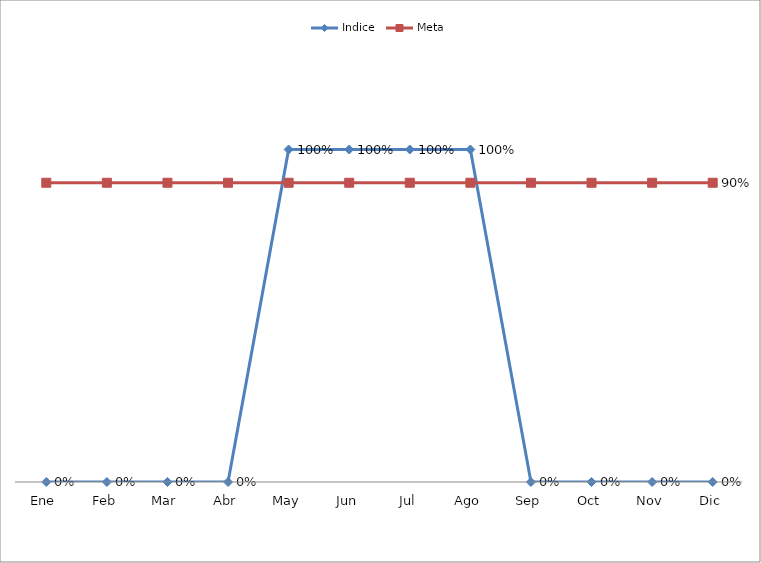
| Category | Indice | Meta |
|---|---|---|
| Ene | 0 | 0.9 |
| Feb | 0 | 0.9 |
| Mar | 0 | 0.9 |
| Abr | 0 | 0.9 |
| May | 1 | 0.9 |
| Jun | 1 | 0.9 |
| Jul | 1 | 0.9 |
| Ago | 1 | 0.9 |
| Sep | 0 | 0.9 |
| Oct | 0 | 0.9 |
| Nov | 0 | 0.9 |
| Dic | 0 | 0.9 |